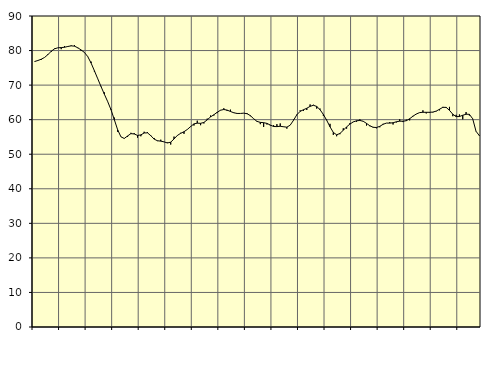
| Category | Piggar | Series 1 |
|---|---|---|
| nan | 76.9 | 76.83 |
| 87.0 | 77.1 | 77.13 |
| 87.0 | 77.3 | 77.5 |
| 87.0 | 78 | 78.01 |
| nan | 79 | 78.84 |
| 88.0 | 79.6 | 79.8 |
| 88.0 | 80.6 | 80.5 |
| 88.0 | 80.8 | 80.8 |
| nan | 80.4 | 80.86 |
| 89.0 | 81.3 | 80.95 |
| 89.0 | 81.1 | 81.18 |
| 89.0 | 81.5 | 81.36 |
| nan | 81.6 | 81.27 |
| 90.0 | 80.7 | 80.8 |
| 90.0 | 79.9 | 80.17 |
| 90.0 | 79.4 | 79.45 |
| nan | 78.3 | 78.25 |
| 91.0 | 76.8 | 76.39 |
| 91.0 | 73.9 | 74.16 |
| 91.0 | 71.9 | 71.86 |
| nan | 69.7 | 69.59 |
| 92.0 | 67.9 | 67.37 |
| 92.0 | 65.2 | 65.24 |
| 92.0 | 63.1 | 62.89 |
| nan | 60.6 | 60.02 |
| 93.0 | 56.5 | 57.1 |
| 93.0 | 55 | 55.03 |
| 93.0 | 54.5 | 54.56 |
| nan | 55 | 55.28 |
| 94.0 | 56.2 | 55.96 |
| 94.0 | 56.1 | 55.86 |
| 94.0 | 54.8 | 55.44 |
| nan | 55.2 | 55.59 |
| 95.0 | 56.5 | 56.15 |
| 95.0 | 56.4 | 56.19 |
| 95.0 | 55.5 | 55.36 |
| nan | 54.7 | 54.37 |
| 96.0 | 53.8 | 53.9 |
| 96.0 | 54.2 | 53.79 |
| 96.0 | 53.6 | 53.57 |
| nan | 53.4 | 53.26 |
| 97.0 | 52.8 | 53.49 |
| 97.0 | 55.1 | 54.42 |
| 97.0 | 55.5 | 55.43 |
| nan | 56.2 | 56.05 |
| 98.0 | 55.9 | 56.51 |
| 98.0 | 57.2 | 57.16 |
| 98.0 | 58.1 | 58 |
| nan | 58.3 | 58.78 |
| 99.0 | 59.7 | 58.99 |
| 99.0 | 58.4 | 58.94 |
| 99.0 | 58.9 | 59.2 |
| nan | 60.3 | 59.95 |
| 0.0 | 61.2 | 60.8 |
| 0.0 | 61.2 | 61.42 |
| 0.0 | 61.9 | 62.13 |
| nan | 62.8 | 62.73 |
| 1.0 | 63.3 | 62.94 |
| 1.0 | 62.5 | 62.77 |
| 1.0 | 62.9 | 62.37 |
| nan | 62.1 | 62 |
| 2.0 | 61.9 | 61.8 |
| 2.0 | 61.8 | 61.8 |
| 2.0 | 61.9 | 61.88 |
| nan | 61.9 | 61.73 |
| 3.0 | 61 | 61.17 |
| 3.0 | 60.3 | 60.26 |
| 3.0 | 59.4 | 59.5 |
| nan | 58.7 | 59.22 |
| 4.0 | 57.9 | 59.13 |
| 4.0 | 58.6 | 58.92 |
| 4.0 | 58.3 | 58.45 |
| nan | 58.4 | 58.02 |
| 5.0 | 58.7 | 57.99 |
| 5.0 | 58.9 | 58.09 |
| 5.0 | 58 | 57.95 |
| nan | 57.4 | 57.83 |
| 6.0 | 58.4 | 58.41 |
| 6.0 | 60 | 59.82 |
| 6.0 | 61.5 | 61.41 |
| nan | 62.7 | 62.4 |
| 7.0 | 62.5 | 62.87 |
| 7.0 | 62.8 | 63.3 |
| 7.0 | 64.4 | 63.85 |
| nan | 64.3 | 64.17 |
| 8.0 | 63.2 | 63.82 |
| 8.0 | 63.2 | 62.88 |
| 8.0 | 61.1 | 61.5 |
| nan | 60 | 59.83 |
| 9.0 | 58.8 | 57.93 |
| 9.0 | 55.6 | 56.31 |
| 9.0 | 55.2 | 55.62 |
| nan | 55.8 | 56.01 |
| 10.0 | 57.5 | 56.93 |
| 10.0 | 57.4 | 57.91 |
| 10.0 | 59 | 58.72 |
| nan | 59.4 | 59.34 |
| 11.0 | 59.4 | 59.68 |
| 11.0 | 60.1 | 59.77 |
| 11.0 | 59.6 | 59.54 |
| nan | 58.3 | 58.92 |
| 12.0 | 58.1 | 58.24 |
| 12.0 | 57.9 | 57.79 |
| 12.0 | 57.5 | 57.73 |
| nan | 57.8 | 58.07 |
| 13.0 | 58.8 | 58.66 |
| 13.0 | 59 | 59.01 |
| 13.0 | 59.3 | 59 |
| nan | 58.6 | 59.11 |
| 14.0 | 59.2 | 59.39 |
| 14.0 | 60.1 | 59.56 |
| 14.0 | 59.3 | 59.55 |
| nan | 60 | 59.7 |
| 15.0 | 59.8 | 60.27 |
| 15.0 | 61.1 | 61 |
| 15.0 | 61.6 | 61.64 |
| nan | 62 | 62.04 |
| 16.0 | 62.7 | 62.14 |
| 16.0 | 61.8 | 62.13 |
| 16.0 | 62 | 62.13 |
| nan | 62.1 | 62.2 |
| 17.0 | 62.4 | 62.48 |
| 17.0 | 62.7 | 63.01 |
| 17.0 | 63.7 | 63.57 |
| nan | 63.4 | 63.56 |
| 18.0 | 63.7 | 62.7 |
| 18.0 | 61 | 61.58 |
| 18.0 | 61.4 | 60.89 |
| nan | 61.5 | 60.9 |
| 19.0 | 60.1 | 61.28 |
| 19.0 | 62.2 | 61.57 |
| 19.0 | 61.2 | 61.55 |
| nan | 60.2 | 60.25 |
| 20.0 | 56.7 | 56.64 |
| 20.0 | 55.5 | 55.37 |